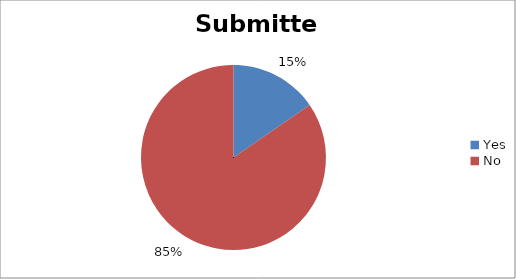
| Category | Submitted |
|---|---|
| Yes | 2 |
| No | 11 |